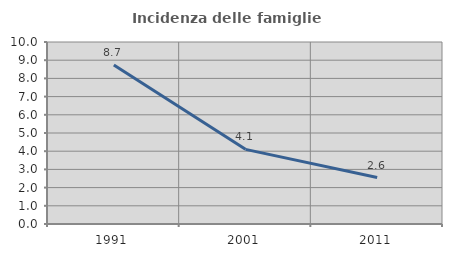
| Category | Incidenza delle famiglie numerose |
|---|---|
| 1991.0 | 8.738 |
| 2001.0 | 4.101 |
| 2011.0 | 2.553 |